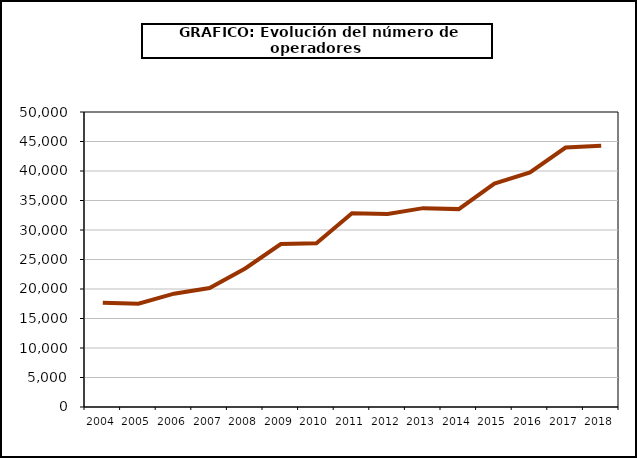
| Category | Operadores (*) |
|---|---|
| 2004.0 | 17688 |
| 2005.0 | 17509 |
| 2006.0 | 19211 |
| 2007.0 | 20171 |
| 2008.0 | 23473 |
| 2009.0 | 27627 |
| 2010.0 | 27767 |
| 2011.0 | 32837 |
| 2012.0 | 32724 |
| 2013.0 | 33704 |
| 2014.0 | 33539 |
| 2015.0 | 37870 |
| 2016.0 | 39744 |
| 2017.0 | 43984 |
| 2018.0 | 44282 |